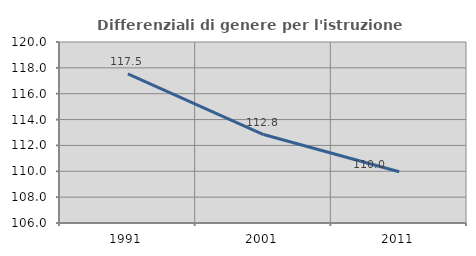
| Category | Differenziali di genere per l'istruzione superiore |
|---|---|
| 1991.0 | 117.537 |
| 2001.0 | 112.84 |
| 2011.0 | 109.959 |